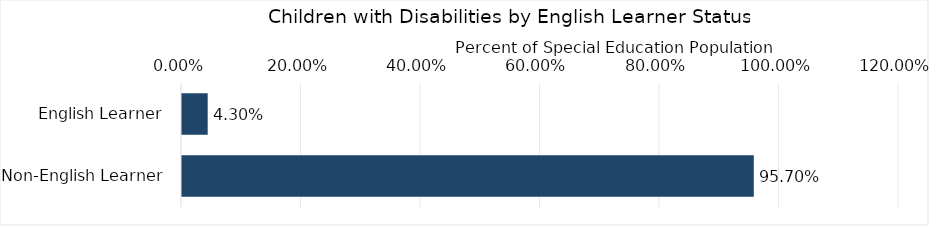
| Category | Percentage |
|---|---|
| English Learner | 0.043 |
| Non-English Learner | 0.957 |